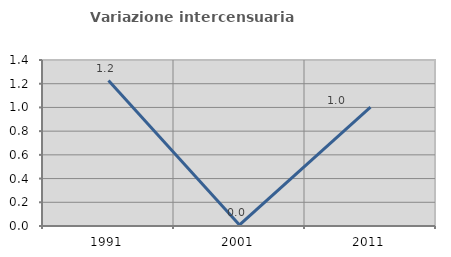
| Category | Variazione intercensuaria annua |
|---|---|
| 1991.0 | 1.226 |
| 2001.0 | 0.009 |
| 2011.0 | 1.003 |